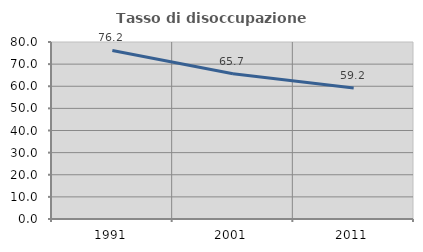
| Category | Tasso di disoccupazione giovanile  |
|---|---|
| 1991.0 | 76.183 |
| 2001.0 | 65.669 |
| 2011.0 | 59.247 |